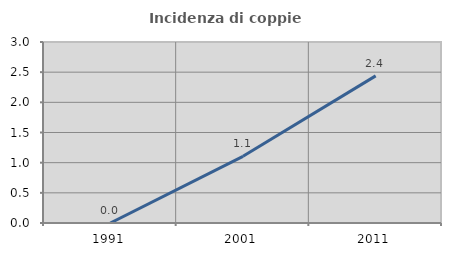
| Category | Incidenza di coppie miste |
|---|---|
| 1991.0 | 0 |
| 2001.0 | 1.105 |
| 2011.0 | 2.439 |